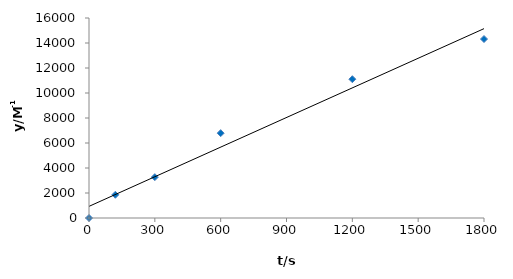
| Category | Series 0 |
|---|---|
| 0.0 | 0 |
| 120.0 | 1856.611 |
| 300.0 | 3267.01 |
| 600.0 | 6788.079 |
| 1200.0 | 11104.409 |
| 1800.0 | 14318.808 |